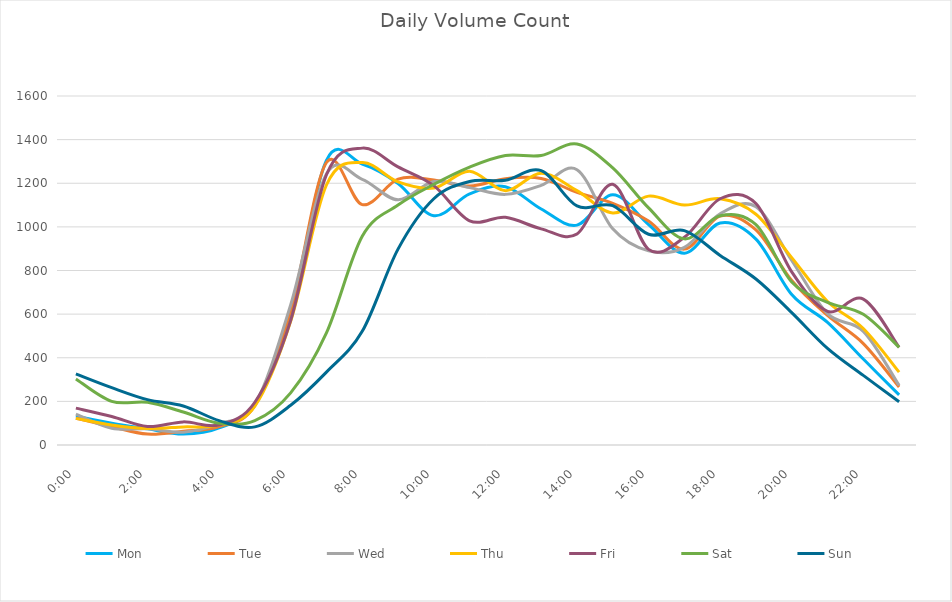
| Category | Mon | Tue | Wed | Thu | Fri | Sat | Sun |
|---|---|---|---|---|---|---|---|
| 0.0 | 133 | 123 | 142 | 122 | 169 | 303 | 326 |
| 0.0416666666666667 | 100 | 84 | 77 | 92 | 131 | 200 | 263 |
| 0.0833333333333333 | 74 | 50 | 74 | 76 | 85 | 196 | 208 |
| 0.125 | 50 | 63 | 59 | 83 | 106 | 151 | 179 |
| 0.166666666666667 | 78 | 84 | 98 | 91 | 92 | 100 | 112 |
| 0.208333333333333 | 189 | 181 | 185 | 178 | 196 | 112 | 83 |
| 0.25 | 600 | 616 | 642 | 567 | 571 | 239 | 182 |
| 0.291666666666667 | 1305 | 1295 | 1243 | 1192 | 1239 | 514 | 334 |
| 0.333333333333333 | 1288 | 1102 | 1218 | 1295 | 1361 | 957 | 521 |
| 0.375 | 1199 | 1219 | 1124 | 1206 | 1275 | 1100 | 898 |
| 0.416666666666667 | 1051 | 1215 | 1208 | 1178 | 1189 | 1195 | 1129 |
| 0.4583333333333333 | 1151 | 1187 | 1180 | 1255 | 1028 | 1274 | 1208 |
| 0.5 | 1184 | 1221 | 1149 | 1166 | 1044 | 1327 | 1214 |
| 0.541666666666667 | 1082 | 1222 | 1190 | 1246 | 991 | 1327 | 1258 |
| 0.5833333333333334 | 1008 | 1158 | 1262 | 1166 | 967 | 1380 | 1096 |
| 0.625 | 1147 | 1108 | 991 | 1064 | 1195 | 1270 | 1097 |
| 0.666666666666667 | 1011 | 1027 | 890 | 1141 | 897 | 1087 | 966 |
| 0.7083333333333334 | 879 | 898 | 906 | 1100 | 952 | 945 | 983 |
| 0.75 | 1018 | 1050 | 1060 | 1129 | 1129 | 1051 | 869 |
| 0.791666666666667 | 944 | 986 | 1092 | 1058 | 1107 | 1010 | 761 |
| 0.8333333333333334 | 690 | 754 | 846 | 859 | 794 | 747 | 607 |
| 0.875 | 562 | 594 | 602 | 658 | 613 | 654 | 443 |
| 0.916666666666667 | 394 | 465 | 521 | 534 | 669 | 599 | 319 |
| 0.9583333333333334 | 230 | 266 | 273 | 334 | 448 | 448 | 198 |